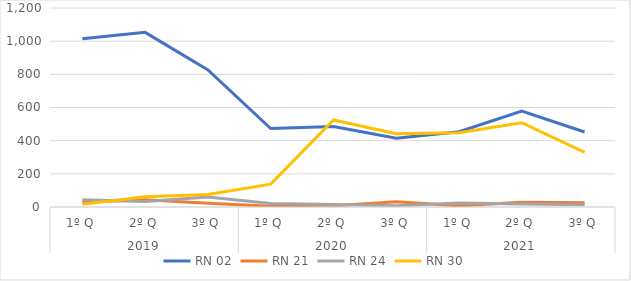
| Category | RN 02 | RN 21 | RN 24 | RN 30 |
|---|---|---|---|---|
| 0 | 1015 | 29 | 44 | 16 |
| 1 | 1053 | 44 | 33 | 62 |
| 2 | 826 | 22 | 61 | 75 |
| 3 | 473 | 5 | 21 | 138 |
| 4 | 485 | 7 | 15 | 525 |
| 5 | 414 | 31 | 8 | 442 |
| 6 | 454 | 7 | 24 | 448 |
| 7 | 579 | 28 | 18 | 508 |
| 8 | 452 | 26 | 14 | 330 |